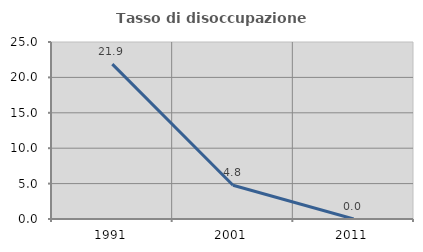
| Category | Tasso di disoccupazione giovanile  |
|---|---|
| 1991.0 | 21.875 |
| 2001.0 | 4.762 |
| 2011.0 | 0 |